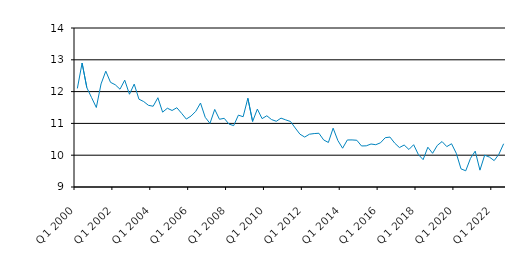
| Category | Series 0 |
|---|---|
| Q1 2000 | 12.1 |
| Q2 2000 | 12.899 |
| Q3 2000 | 12.125 |
| Q4 2000 | 11.812 |
| Q1 2001 | 11.5 |
| Q2 2001 | 12.241 |
| Q3 2001 | 12.642 |
| Q4 2001 | 12.291 |
| Q1 2002 | 12.215 |
| Q2 2002 | 12.075 |
| Q3 2002 | 12.36 |
| Q4 2002 | 11.917 |
| Q1 2003 | 12.236 |
| Q2 2003 | 11.761 |
| Q3 2003 | 11.688 |
| Q4 2003 | 11.569 |
| Q1 2004 | 11.539 |
| Q2 2004 | 11.807 |
| Q3 2004 | 11.354 |
| Q4 2004 | 11.477 |
| Q1 2005 | 11.406 |
| Q2 2005 | 11.493 |
| Q3 2005 | 11.318 |
| Q4 2005 | 11.136 |
| Q1 2006 | 11.231 |
| Q2 2006 | 11.38 |
| Q3 2006 | 11.64 |
| Q4 2006 | 11.19 |
| Q1 2007 | 11 |
| Q2 2007 | 11.44 |
| Q3 2007 | 11.13 |
| Q4 2007 | 11.16 |
| Q1 2008 | 10.98 |
| Q2 2008 | 10.93 |
| Q3 2008 | 11.26 |
| Q4 2008 | 11.21 |
| Q1 2009 | 11.79 |
| Q2 2009 | 11.06 |
| Q3 2009 | 11.45 |
| Q4 2009 | 11.15 |
| Q1 2010 | 11.24 |
| Q2 2010 | 11.12 |
| Q3 2010 | 11.067 |
| Q4 2010 | 11.166 |
| Q1 2011 | 11.11 |
| Q2 2011 | 11.06 |
| Q3 2011 | 10.855 |
| Q4 2011 | 10.66 |
| Q1 2012 | 10.57 |
| Q2 2012 | 10.66 |
| Q3 2012 | 10.68 |
| Q4 2012 | 10.69 |
| Q1 2013 | 10.48 |
| Q2 2013 | 10.4 |
| Q3 2013 | 10.85 |
| Q4 2013 | 10.46 |
| Q1 2014 | 10.22 |
| Q2 2014 | 10.479 |
| Q3 2014 | 10.48 |
| Q4 2014 | 10.47 |
| Q1 2015 | 10.29 |
| Q2 2015 | 10.295 |
| Q3 2015 | 10.352 |
| Q4 2015 | 10.33 |
| Q1 2016 | 10.39 |
| Q2 2016 | 10.55 |
| Q3 2016 | 10.57 |
| Q4 2016 | 10.38 |
| Q1 2017 | 10.24 |
| Q2 2017 | 10.32 |
| Q3 2017 | 10.18 |
| Q4 2017 | 10.33 |
| Q1 2018 | 10.02 |
| Q2 2018 | 9.86 |
| Q3 2018 | 10.251 |
| Q4 2018 | 10.06 |
| Q1 2019 | 10.308 |
| Q2 2019 | 10.429 |
| Q3 2019 | 10.27 |
| Q4 2019 | 10.36 |
| Q1 2020 | 10.06 |
| Q2 2020 | 9.57 |
| Q3 2020 | 9.51 |
| Q4 2020 | 9.9 |
| Q1 2021 | 10.128 |
| Q2 2021 | 9.53 |
| Q3 2021 | 10 |
| Q4 2021 | 9.94 |
| Q1 2022 | 9.83 |
| Q2 2022 | 10.03 |
| Q3 2022 | 10.36 |